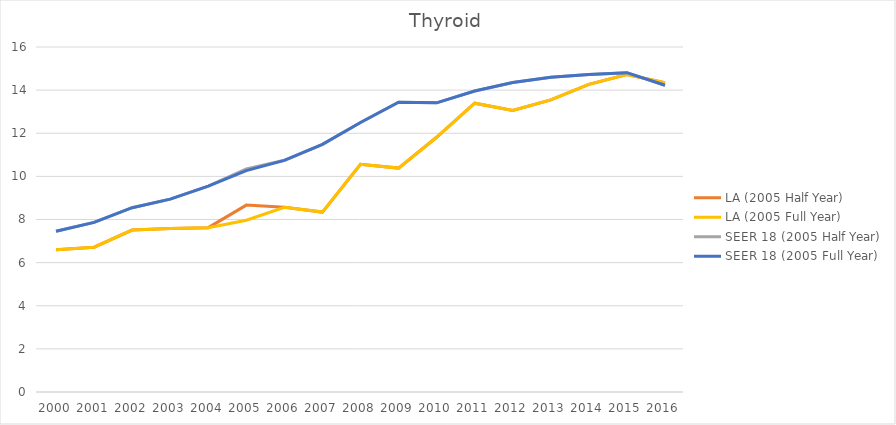
| Category | LA (2005 Half Year) | LA (2005 Full Year) | SEER 18 (2005 Half Year) | SEER 18 (2005 Full Year) |
|---|---|---|---|---|
| 2000.0 | 6.593 | 6.593 | 7.453 | 7.453 |
| 2001.0 | 6.716 | 6.716 | 7.867 | 7.867 |
| 2002.0 | 7.508 | 7.508 | 8.548 | 8.548 |
| 2003.0 | 7.587 | 7.587 | 8.946 | 8.946 |
| 2004.0 | 7.622 | 7.622 | 9.547 | 9.547 |
| 2005.0 | 8.667 | 7.966 | 10.347 | 10.266 |
| 2006.0 | 8.563 | 8.563 | 10.744 | 10.744 |
| 2007.0 | 8.344 | 8.344 | 11.487 | 11.487 |
| 2008.0 | 10.563 | 10.563 | 12.5 | 12.5 |
| 2009.0 | 10.385 | 10.385 | 13.438 | 13.438 |
| 2010.0 | 11.814 | 11.814 | 13.409 | 13.409 |
| 2011.0 | 13.395 | 13.395 | 13.961 | 13.961 |
| 2012.0 | 13.055 | 13.055 | 14.351 | 14.351 |
| 2013.0 | 13.548 | 13.548 | 14.597 | 14.597 |
| 2014.0 | 14.269 | 14.269 | 14.725 | 14.725 |
| 2015.0 | 14.726 | 14.726 | 14.809 | 14.809 |
| 2016.0 | 14.342 | 14.342 | 14.226 | 14.226 |